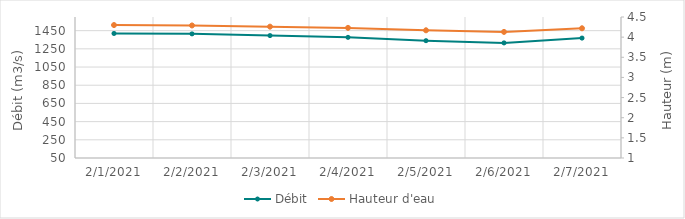
| Category | Débit |
|---|---|
| 2/2/21 | 1415.52 |
| 2/1/21 | 1418.99 |
| 1/31/21 | 1421.75 |
| 1/30/21 | 1411.01 |
| 1/29/21 | 1420.86 |
| 1/28/21 | 1433.88 |
| 1/27/21 | 1346.51 |